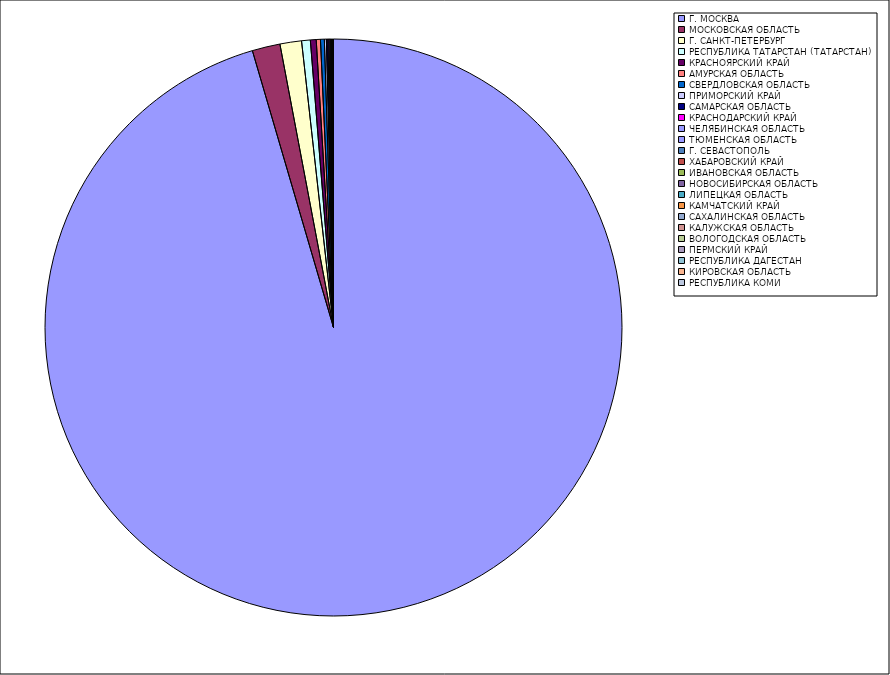
| Category | Оборот |
|---|---|
| Г. МОСКВА | 95.404 |
| МОСКОВСКАЯ ОБЛАСТЬ | 1.561 |
| Г. САНКТ-ПЕТЕРБУРГ | 1.206 |
| РЕСПУБЛИКА ТАТАРСТАН (ТАТАРСТАН) | 0.487 |
| КРАСНОЯРСКИЙ КРАЙ | 0.325 |
| АМУРСКАЯ ОБЛАСТЬ | 0.234 |
| СВЕРДЛОВСКАЯ ОБЛАСТЬ | 0.216 |
| ПРИМОРСКИЙ КРАЙ | 0.111 |
| САМАРСКАЯ ОБЛАСТЬ | 0.082 |
| КРАСНОДАРСКИЙ КРАЙ | 0.061 |
| ЧЕЛЯБИНСКАЯ ОБЛАСТЬ | 0.061 |
| ТЮМЕНСКАЯ ОБЛАСТЬ | 0.041 |
| Г. СЕВАСТОПОЛЬ | 0.022 |
| ХАБАРОВСКИЙ КРАЙ | 0.019 |
| ИВАНОВСКАЯ ОБЛАСТЬ | 0.016 |
| НОВОСИБИРСКАЯ ОБЛАСТЬ | 0.013 |
| ЛИПЕЦКАЯ ОБЛАСТЬ | 0.013 |
| КАМЧАТСКИЙ КРАЙ | 0.012 |
| САХАЛИНСКАЯ ОБЛАСТЬ | 0.012 |
| КАЛУЖСКАЯ ОБЛАСТЬ | 0.009 |
| ВОЛОГОДСКАЯ ОБЛАСТЬ | 0.008 |
| ПЕРМСКИЙ КРАЙ | 0.007 |
| РЕСПУБЛИКА ДАГЕСТАН | 0.006 |
| КИРОВСКАЯ ОБЛАСТЬ | 0.006 |
| РЕСПУБЛИКА КОМИ | 0.005 |